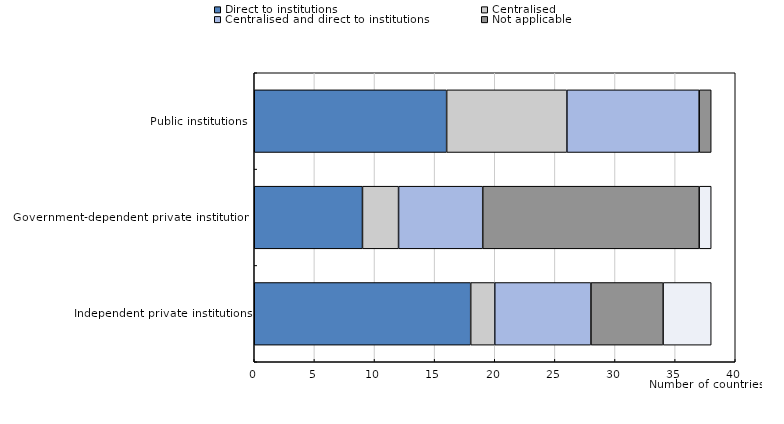
| Category | Direct to institutions | Centralised | Centralised and direct to institutions | Not applicable | Missing |
|---|---|---|---|---|---|
| Independent private institutions | 18 | 2 | 8 | 6 | 4 |
| Government-dependent private institutions | 9 | 3 | 7 | 18 | 1 |
| Public institutions | 16 | 10 | 11 | 1 | 0 |